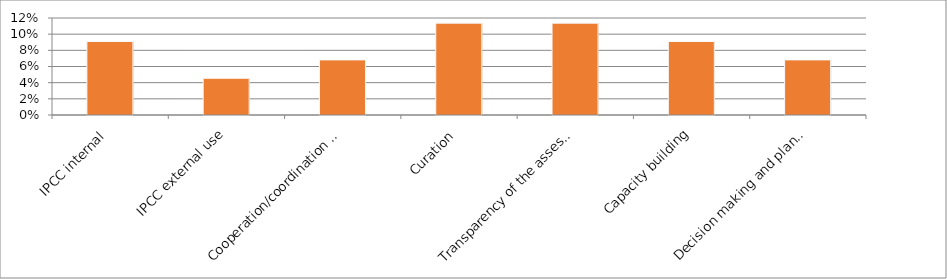
| Category | Series 0 |
|---|---|
| IPCC internal | 0.091 |
| IPCC external use | 0.045 |
| Cooperation/coordination among working groups | 0.068 |
| Curation | 0.114 |
| Transparency of the assessment | 0.114 |
| Capacity building | 0.091 |
| Decision making and planning | 0.068 |